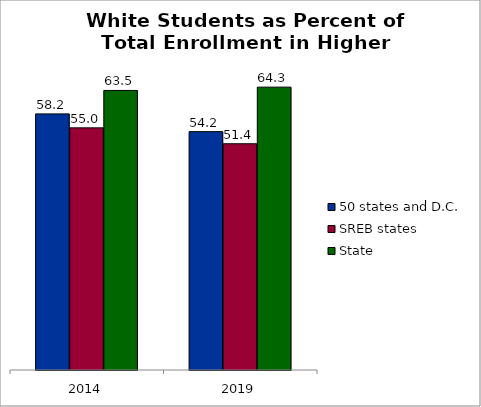
| Category | 50 states and D.C. | SREB states | State |
|---|---|---|---|
| 2014.0 | 58.206 | 55.03 | 63.534 |
| 2019.0 | 54.175 | 51.417 | 64.288 |